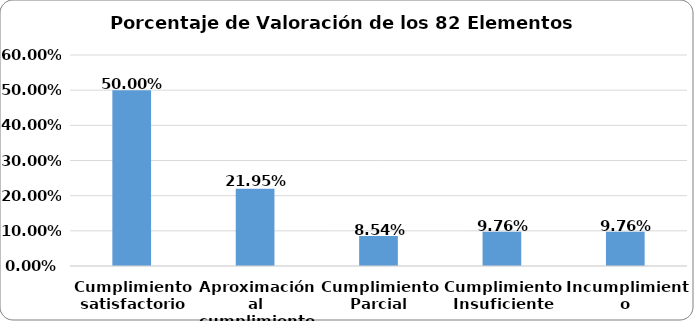
| Category | Series 0 |
|---|---|
| Cumplimiento satisfactorio | 0.5 |
| Aproximación al cumplimiento | 0.22 |
| Cumplimiento Parcial | 0.085 |
| Cumplimiento Insuficiente | 0.098 |
| Incumplimiento | 0.098 |